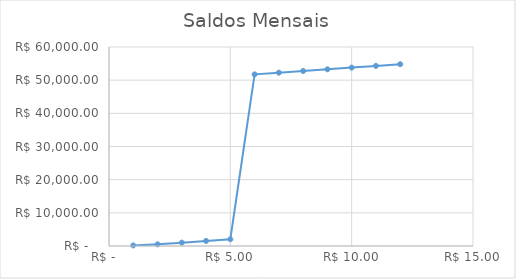
| Category | Saldos Mensais |
|---|---|
| 0 | 171.1 |
| 1 | 502.2 |
| 2 | 1013.3 |
| 3 | 1524.4 |
| 4 | 2035.5 |
| 5 | 51746.6 |
| 6 | 52257.7 |
| 7 | 52768.8 |
| 8 | 53279.9 |
| 9 | 53791 |
| 10 | 54302.1 |
| 11 | 54808.2 |